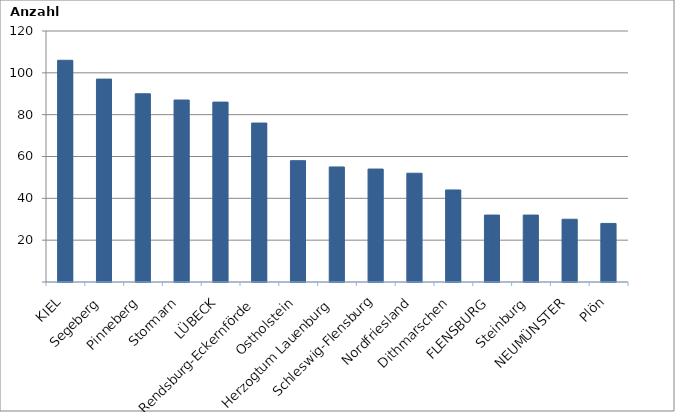
| Category | Series 0 |
|---|---|
| KIEL | 106 |
| Segeberg | 97 |
| Pinneberg | 90 |
| Stormarn | 87 |
| LÜBECK | 86 |
| Rendsburg-Eckernförde | 76 |
| Ostholstein | 58 |
| Herzogtum Lauenburg | 55 |
| Schleswig-Flensburg | 54 |
| Nordfriesland | 52 |
| Dithmarschen | 44 |
| FLENSBURG | 32 |
| Steinburg | 32 |
| NEUMÜNSTER | 30 |
| Plön | 28 |